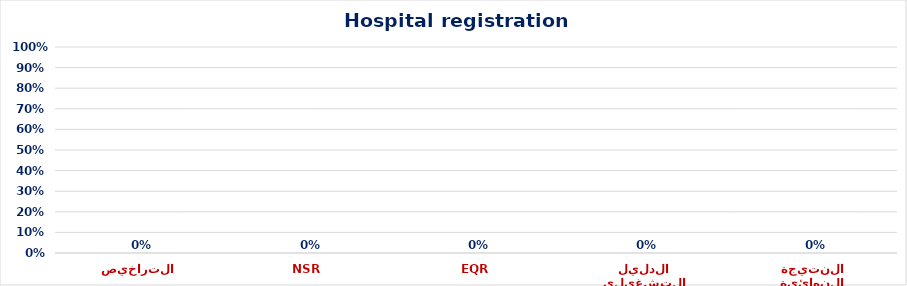
| Category | Series 0 |
|---|---|
| التراخيص | 0 |
| NSR | 0 |
| EQR | 0 |
| الدليل التشغيلي | 0 |
| النتيجة النهائية | 0 |